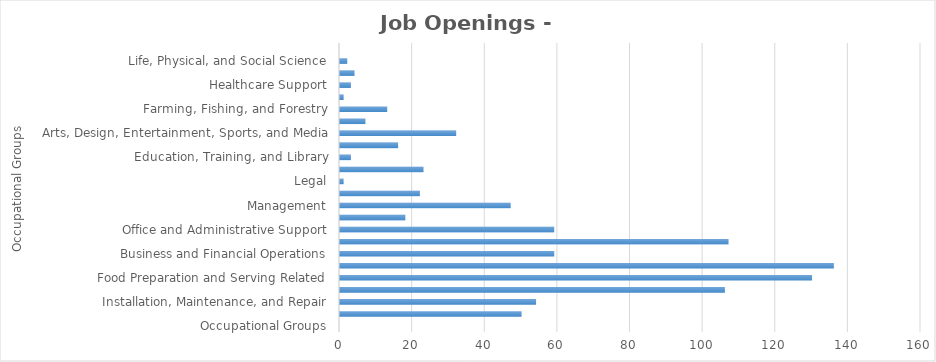
| Category | Series1 |
|---|---|
| Occupational Groups | 0 |
| Construction and Extraction | 50 |
| Installation, Maintenance, and Repair | 54 |
| Building and Grounds Cleaning and Maintenance | 106 |
| Food Preparation and Serving Related | 130 |
| Personal Care and Service | 136 |
| Business and Financial Operations | 59 |
| Sales and Related | 107 |
| Office and Administrative Support | 59 |
| Architecture and Engineering | 18 |
| Management | 47 |
| Transportation and Material Moving | 22 |
| Legal | 1 |
| Healthcare Practitioners and Technical | 23 |
| Education, Training, and Library | 3 |
| Production | 16 |
| Arts, Design, Entertainment, Sports, and Media | 32 |
| Computer and Mathematical | 7 |
| Farming, Fishing, and Forestry | 13 |
| Community and Social Services | 1 |
| Healthcare Support | 3 |
| Protective Service | 4 |
| Life, Physical, and Social Science | 2 |
| Military Specific  | 0 |